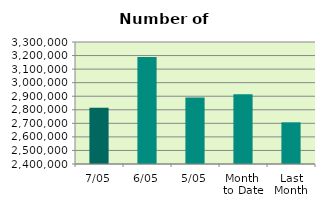
| Category | Series 0 |
|---|---|
| 7/05 | 2814942 |
| 6/05 | 3189418 |
| 5/05 | 2890118 |
| Month 
to Date | 2914951.6 |
| Last
Month | 2707305.9 |